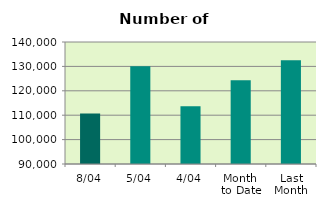
| Category | Series 0 |
|---|---|
| 8/04 | 110722 |
| 5/04 | 130076 |
| 4/04 | 113648 |
| Month 
to Date | 124282 |
| Last
Month | 132498.571 |